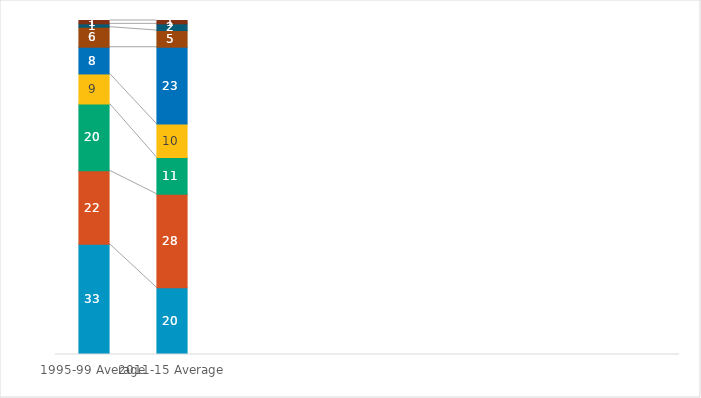
| Category | High income Asia and Pacific | North America | Europe and Central Asia | South America and Caribbean | Developing East Asia | Middle East and North Africa | Sub-Saharan Africa | South Asia |
|---|---|---|---|---|---|---|---|---|
| 1995-99 Average | 33 | 22 | 20 | 9 | 8 | 6 | 1 | 1 |
| 2011-15 Average | 20 | 28 | 11 | 10 | 23 | 5 | 2 | 1 |